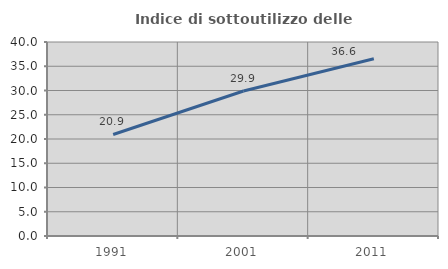
| Category | Indice di sottoutilizzo delle abitazioni  |
|---|---|
| 1991.0 | 20.932 |
| 2001.0 | 29.893 |
| 2011.0 | 36.558 |